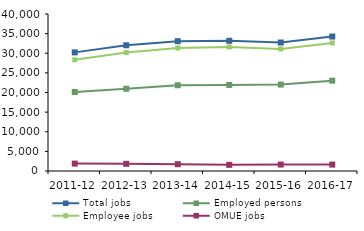
| Category | Total jobs | Employed persons | Employee jobs | OMUE jobs |
|---|---|---|---|---|
| 2011-12 | 30222 | 20127 | 28334 | 1889 |
| 2012-13 | 32033 | 20953 | 30201 | 1829 |
| 2013-14 | 33072 | 21843 | 31342 | 1731 |
| 2014-15 | 33174 | 21927 | 31605 | 1567 |
| 2015-16 | 32734 | 22019 | 31098 | 1636 |
| 2016-17 | 34256 | 23008 | 32625 | 1631 |